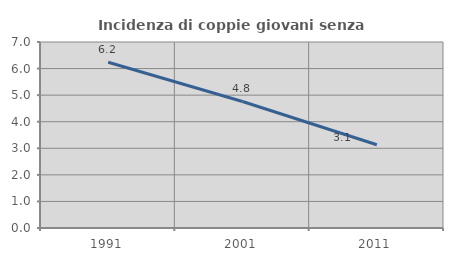
| Category | Incidenza di coppie giovani senza figli |
|---|---|
| 1991.0 | 6.236 |
| 2001.0 | 4.762 |
| 2011.0 | 3.133 |